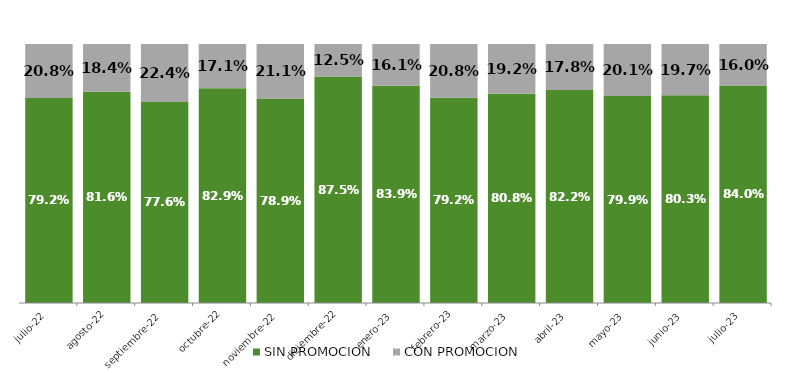
| Category | SIN PROMOCION   | CON PROMOCION   |
|---|---|---|
| 2022-07-01 | 0.792 | 0.208 |
| 2022-08-01 | 0.816 | 0.184 |
| 2022-09-01 | 0.776 | 0.224 |
| 2022-10-01 | 0.829 | 0.171 |
| 2022-11-01 | 0.789 | 0.211 |
| 2022-12-01 | 0.875 | 0.125 |
| 2023-01-01 | 0.839 | 0.161 |
| 2023-02-01 | 0.792 | 0.208 |
| 2023-03-01 | 0.808 | 0.192 |
| 2023-04-01 | 0.822 | 0.178 |
| 2023-05-01 | 0.799 | 0.201 |
| 2023-06-01 | 0.803 | 0.197 |
| 2023-07-01 | 0.84 | 0.16 |